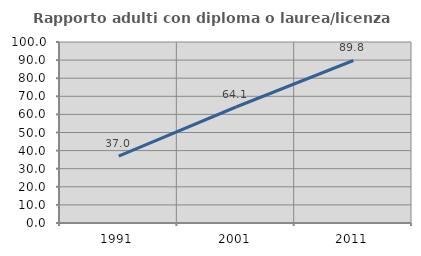
| Category | Rapporto adulti con diploma o laurea/licenza media  |
|---|---|
| 1991.0 | 36.992 |
| 2001.0 | 64.09 |
| 2011.0 | 89.781 |